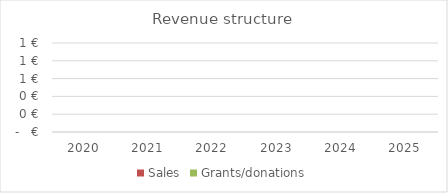
| Category | Sales | Grants/donations |
|---|---|---|
| 2020.0 | 0 | 0 |
| 2021.0 | 0 | 0 |
| 2022.0 | 0 | 0 |
| 2023.0 | 0 | 0 |
| 2024.0 | 0 | 0 |
| 2025.0 | 0 | 0 |